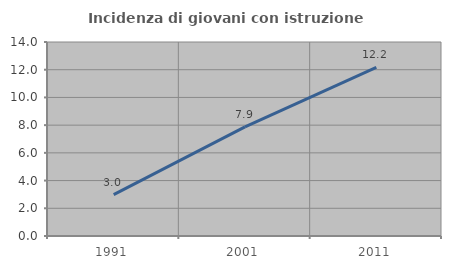
| Category | Incidenza di giovani con istruzione universitaria |
|---|---|
| 1991.0 | 2.988 |
| 2001.0 | 7.874 |
| 2011.0 | 12.162 |